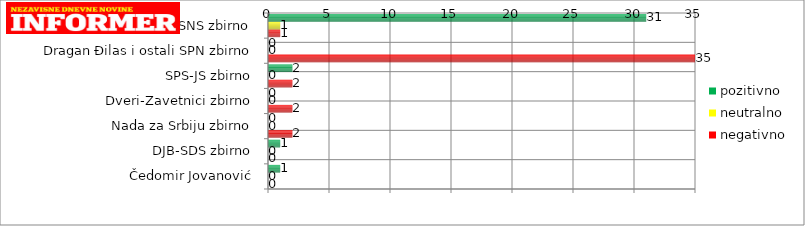
| Category | pozitivno | neutralno | negativno |
|---|---|---|---|
| Aleksandar Vučić i ostali SNS zbirno | 31 | 1 | 1 |
| Dragan Đilas i ostali SPN zbirno | 0 | 0 | 35 |
| SPS-JS zbirno | 2 | 0 | 2 |
| Dveri-Zavetnici zbirno | 0 | 0 | 2 |
| Nada za Srbiju zbirno | 0 | 0 | 2 |
| DJB-SDS zbirno | 1 | 0 | 0 |
| Čedomir Jovanović | 1 | 0 | 0 |